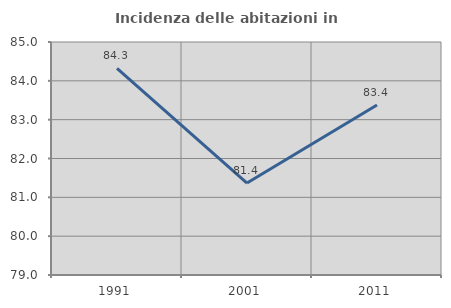
| Category | Incidenza delle abitazioni in proprietà  |
|---|---|
| 1991.0 | 84.32 |
| 2001.0 | 81.368 |
| 2011.0 | 83.379 |